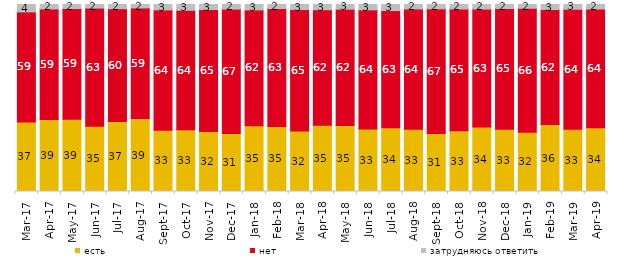
| Category | есть | нет | затрудняюсь ответить |
|---|---|---|---|
| 2017-03-01 | 37.2 | 58.85 | 3.95 |
| 2017-04-01 | 38.5 | 59.1 | 2.4 |
| 2017-05-01 | 38.7 | 59.15 | 2.15 |
| 2017-06-01 | 34.95 | 63.15 | 1.9 |
| 2017-07-01 | 37.4 | 60.35 | 2.25 |
| 2017-08-01 | 39 | 59.15 | 1.85 |
| 2017-09-01 | 32.8 | 64.3 | 2.9 |
| 2017-10-01 | 33 | 63.9 | 3.1 |
| 2017-11-01 | 32.1 | 65.15 | 2.7 |
| 2017-12-01 | 30.95 | 66.6 | 2.45 |
| 2018-01-01 | 35.2 | 61.9 | 2.9 |
| 2018-02-01 | 34.8 | 63.05 | 2.15 |
| 2018-03-01 | 32.35 | 64.95 | 2.7 |
| 2018-04-01 | 35.45 | 61.75 | 2.8 |
| 2018-05-01 | 35.3 | 62.15 | 2.5 |
| 2018-06-01 | 33.45 | 63.7 | 2.85 |
| 2018-07-01 | 34.05 | 62.7 | 3.25 |
| 2018-08-01 | 33.3 | 64.3 | 2.4 |
| 2018-09-01 | 31 | 66.7 | 2.3 |
| 2018-10-01 | 32.55 | 65.05 | 2.4 |
| 2018-11-01 | 34.431 | 63.124 | 2.445 |
| 2018-12-01 | 33.25 | 64.6 | 2.15 |
| 2019-01-01 | 31.75 | 66.25 | 2 |
| 2019-02-01 | 35.8 | 61.5 | 2.7 |
| 2019-03-01 | 33.317 | 64.147 | 2.536 |
| 2019-04-01 | 34.059 | 63.515 | 2.426 |